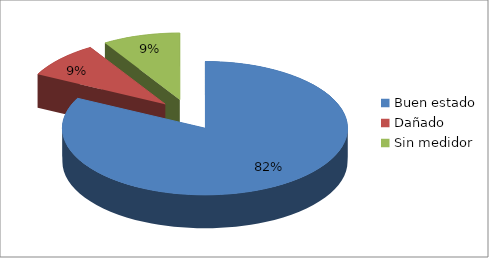
| Category | Series 0 |
|---|---|
| Buen estado  | 0.824 |
| Dañado  | 0.088 |
| Sin medidor | 0.088 |